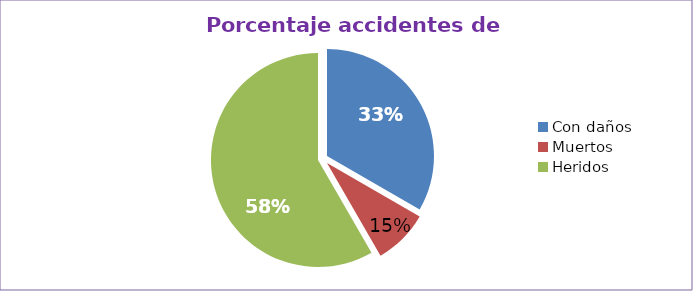
| Category | Series 0 |
|---|---|
| Con daños  | 33.333 |
| Muertos  | 8.333 |
| Heridos  | 58.333 |